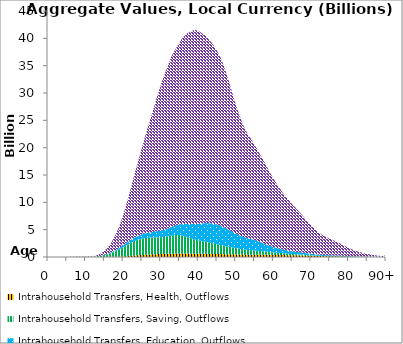
| Category | Intrahousehold Transfers, Health, Outflows | Intrahousehold Transfers, Saving, Outflows | Intrahousehold Transfers, Education, Outflows | Intrahousehold Transfers, Consumption other than health and education, Outflows |
|---|---|---|---|---|
| 0 | 0 | 0 | 0 | 0 |
|  | 0 | 0 | 0 | 0 |
| 2 | 0 | 0 | 0 | 0 |
| 3 | 0 | 0 | 0 | 0 |
| 4 | 0 | 0 | 0 | 0 |
| 5 | 0 | 1.697 | 0 | 0.205 |
| 6 | 0.385 | 12.001 | 0 | 14.164 |
| 7 | 0.902 | 18.297 | 2.257 | 37.566 |
| 8 | 1.285 | 22.786 | 3.687 | 56.967 |
| 9 | 1.55 | 24.053 | 4.482 | 70.419 |
| 10 | 1.724 | 24.812 | 5.07 | 80.099 |
| 11 | 2.033 | 24.506 | 5.264 | 85.195 |
| 12 | 2.618 | 46.425 | 6.681 | 110.266 |
| 13 | 4.205 | 99.531 | 12.257 | 187.49 |
| 14 | 7.565 | 199.107 | 26.077 | 377.091 |
| 15 | 12.402 | 353.602 | 49.291 | 698.11 |
| 16 | 19.162 | 535.738 | 82.183 | 1167.712 |
| 17 | 30.442 | 745.159 | 134.082 | 1878.853 |
| 18 | 47.369 | 1004.828 | 204.63 | 2822.412 |
| 19 | 71.389 | 1330.831 | 286.623 | 4016.724 |
| 20 | 107.973 | 1648.726 | 377.117 | 5497.183 |
| 21 | 152.772 | 1996.051 | 484.08 | 7296.723 |
| 22 | 203.164 | 2349.987 | 578.934 | 9321.028 |
| 23 | 262.645 | 2652.766 | 651.545 | 11517.984 |
| 24 | 318.965 | 2833.316 | 702.185 | 13693.459 |
| 25 | 367.904 | 2976.697 | 791.435 | 15863.366 |
| 26 | 414.691 | 3066.489 | 854.471 | 18073.191 |
| 27 | 458.255 | 3085.902 | 928.792 | 20199.861 |
| 28 | 489.117 | 3063.894 | 1026.708 | 22288.248 |
| 29 | 518.886 | 3059.026 | 1144.984 | 24540.478 |
| 30 | 547.26 | 3048.424 | 1215.864 | 26634.057 |
| 31 | 569.984 | 3107.98 | 1316.297 | 28387.038 |
| 32 | 588.422 | 3201.648 | 1443.633 | 29954.483 |
| 33 | 606.279 | 3308.645 | 1587.737 | 31388.112 |
| 34 | 618.184 | 3389.753 | 1754.111 | 32313.587 |
| 35 | 622.493 | 3397.178 | 1964.934 | 33252.113 |
| 36 | 622.861 | 3242.437 | 2174.337 | 34194.762 |
| 37 | 620.863 | 3042.014 | 2360.722 | 34867.986 |
| 38 | 614.409 | 2826.311 | 2575.839 | 35216.672 |
| 39 | 605.53 | 2611.738 | 2800.498 | 35528.562 |
| 40 | 596.443 | 2438.995 | 2997.413 | 35367.177 |
| 41 | 587.082 | 2330.975 | 3201.919 | 34798.583 |
| 42 | 575.484 | 2218.129 | 3423.758 | 34222.783 |
| 43 | 562.656 | 2075.958 | 3553.375 | 33488.205 |
| 44 | 549.875 | 1924.021 | 3602.4 | 32729.317 |
| 45 | 536.697 | 1781.97 | 3622.465 | 31791.176 |
| 46 | 527.573 | 1647.831 | 3537.551 | 30685.876 |
| 47 | 515.592 | 1520.028 | 3350.454 | 29233.735 |
| 48 | 504.948 | 1402.068 | 3133.231 | 27531.563 |
| 49 | 490.098 | 1283.937 | 2891.253 | 25492.309 |
| 50 | 474.384 | 1166.85 | 2648.218 | 23617.867 |
| 51 | 452.447 | 1049.942 | 2462.417 | 21911.153 |
| 52 | 435.412 | 948.972 | 2299.523 | 20387.039 |
| 53 | 423.406 | 869.796 | 2168.335 | 19242.552 |
| 54 | 425.935 | 808.497 | 2069.99 | 18351.48 |
| 55 | 426.836 | 748.188 | 1925.898 | 17426.391 |
| 56 | 427.562 | 690.614 | 1743.792 | 16476.172 |
| 57 | 425.694 | 631.724 | 1546.173 | 15559.607 |
| 58 | 418.109 | 573.979 | 1337.257 | 14569.576 |
| 59 | 400.728 | 516.146 | 1132.571 | 13524.362 |
| 60 | 385.278 | 461.925 | 974.192 | 12561.474 |
| 61 | 370.316 | 413.62 | 831.375 | 11666.438 |
| 62 | 356.29 | 369.544 | 716.653 | 10824.493 |
| 63 | 343.852 | 325.348 | 624.504 | 10028.567 |
| 64 | 331.459 | 280.082 | 543.971 | 9316.611 |
| 65 | 317.759 | 237.594 | 477.162 | 8639.351 |
| 66 | 304.645 | 197.958 | 437.67 | 8000.082 |
| 67 | 287.761 | 162.225 | 403.59 | 7333.985 |
| 68 | 267.702 | 130.924 | 375.411 | 6638.016 |
| 69 | 245.361 | 106.424 | 338.285 | 5933.868 |
| 70 | 223.31 | 84.346 | 297.542 | 5271.681 |
| 71 | 201.675 | 65.924 | 247.802 | 4630.747 |
| 72 | 181.903 | 50.969 | 202.942 | 4090.114 |
| 73 | 164.75 | 38.162 | 172.107 | 3680.539 |
| 74 | 152.058 | 27.94 | 152.408 | 3360.953 |
| 75 | 139.298 | 20.82 | 142.818 | 3053.249 |
| 76 | 128.122 | 15.198 | 139.597 | 2778.5 |
| 77 | 116.522 | 10.267 | 142.582 | 2488.784 |
| 78 | 103.665 | 6.919 | 134.927 | 2157.951 |
| 79 | 89.43 | 4.482 | 123.459 | 1811.489 |
| 80 | 76.787 | 2.687 | 104.674 | 1505.021 |
| 81 | 64.766 | 1.398 | 85.171 | 1225.32 |
| 82 | 54.356 | 0.734 | 63.075 | 985.644 |
| 83 | 46.141 | 0.988 | 45.882 | 794.989 |
| 84 | 39.142 | 1.216 | 33.816 | 641.973 |
| 85 | 32.347 | 1.463 | 25.777 | 504.433 |
| 86 | 25.928 | 1.564 | 18.992 | 382.898 |
| 87 | 20.354 | 1.358 | 13.937 | 283.046 |
| 88 | 15.745 | 0.82 | 9.182 | 204.62 |
| 89 | 11.982 | 0.416 | 5.495 | 144.636 |
| 90+ | 25.076 | 0.446 | 8.465 | 280.15 |